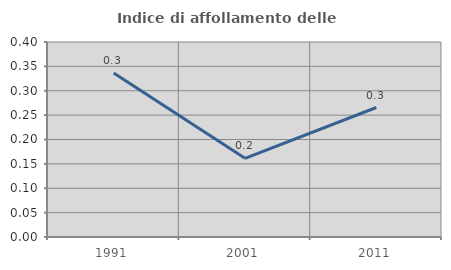
| Category | Indice di affollamento delle abitazioni  |
|---|---|
| 1991.0 | 0.336 |
| 2001.0 | 0.161 |
| 2011.0 | 0.266 |